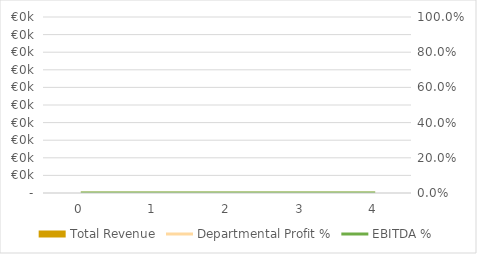
| Category | Total Revenue |
|---|---|
| 0.0 | 0 |
| 1.0 | 0 |
| 2.0 | 0 |
| 3.0 | 0 |
| 4.0 | 0 |